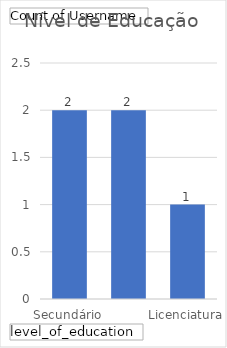
| Category | Total |
|---|---|
|  | 2 |
| Secundário | 2 |
| Licenciatura | 1 |